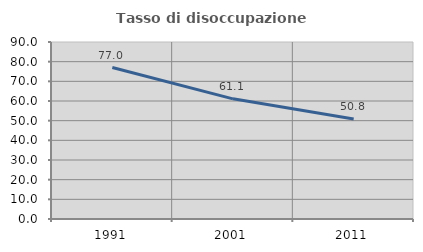
| Category | Tasso di disoccupazione giovanile  |
|---|---|
| 1991.0 | 77.025 |
| 2001.0 | 61.094 |
| 2011.0 | 50.826 |